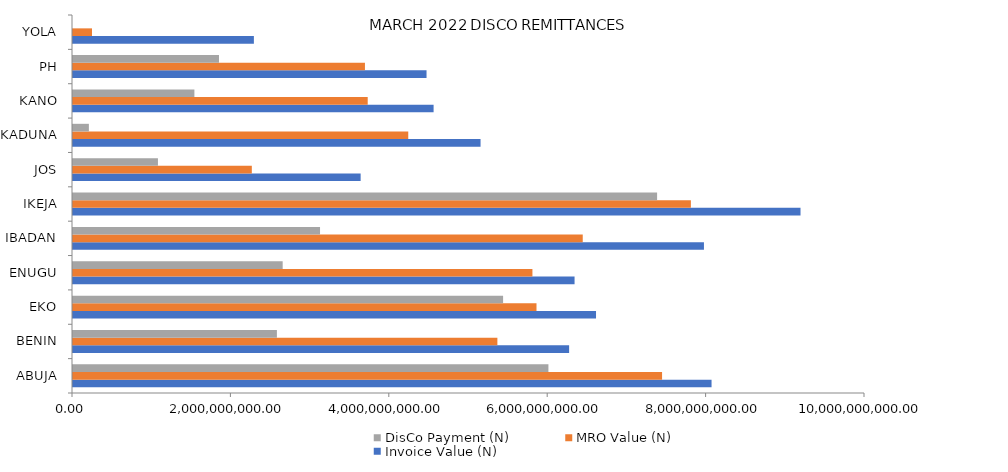
| Category | Invoice Value (N) | MRO Value (N) | DisCo Payment (N) |
|---|---|---|---|
| ABUJA | 8062556292.354 | 7437708179.697 | 6002768704.31 |
| BENIN | 6264169894.029 | 5358370927.352 | 2574531967.56 |
| EKO | 6603820221.339 | 5852305480.15 | 5430562758.52 |
| ENUGU | 6332885935.828 | 5800923517.219 | 2647386173.99 |
| IBADAN | 7966558755.441 | 6436182818.521 | 3119032008.54 |
| IKEJA | 9185821094.907 | 7801517855.905 | 7374900404.97 |
| JOS | 3631806849.126 | 2257894318.102 | 1072483678.61 |
| KADUNA | 5145904570.637 | 4233021099.806 | 200531975.97 |
| KANO | 4552955646.884 | 3721130650.198 | 1532758971.38 |
| PH | 4463842964.517 | 3686241520.098 | 1843245631.9 |
| YOLA | 2283875172.795 | 239806893.143 | 0 |